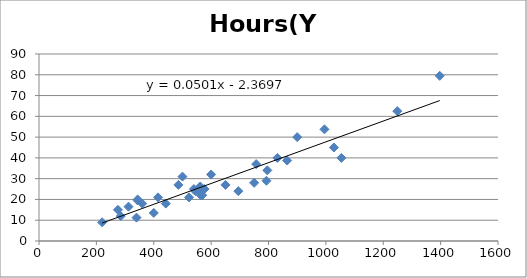
| Category | Hours(Y) |
|---|---|
| 545.0 | 24 |
| 400.0 | 13.5 |
| 562.0 | 26.25 |
| 540.0 | 25 |
| 220.0 | 9 |
| 344.0 | 20 |
| 569.0 | 22 |
| 340.0 | 11.25 |
| 900.0 | 50 |
| 285.0 | 12 |
| 865.0 | 38.75 |
| 831.0 | 40 |
| 344.0 | 19.5 |
| 360.0 | 18 |
| 750.0 | 28 |
| 650.0 | 27 |
| 415.0 | 21 |
| 275.0 | 15 |
| 557.0 | 25 |
| 1028.0 | 45 |
| 793.0 | 29 |
| 523.0 | 21 |
| 564.0 | 22 |
| 312.0 | 16.5 |
| 757.0 | 37 |
| 600.0 | 32 |
| 796.0 | 34 |
| 577.0 | 25 |
| 500.0 | 31 |
| 695.0 | 24 |
| 1054.0 | 40 |
| 486.0 | 27 |
| 442.0 | 18 |
| 1249.0 | 62.5 |
| 995.0 | 53.75 |
| 1397.0 | 79.5 |